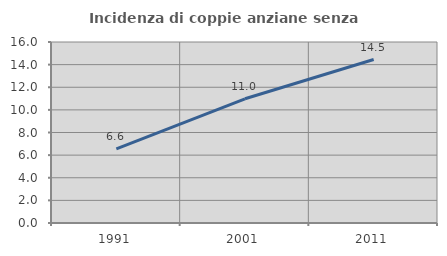
| Category | Incidenza di coppie anziane senza figli  |
|---|---|
| 1991.0 | 6.559 |
| 2001.0 | 10.979 |
| 2011.0 | 14.45 |